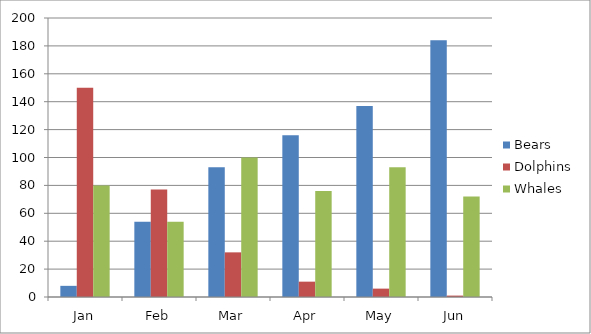
| Category | Bears | Dolphins | Whales |
|---|---|---|---|
| Jan | 8 | 150 | 80 |
| Feb | 54 | 77 | 54 |
| Mar | 93 | 32 | 100 |
| Apr | 116 | 11 | 76 |
| May | 137 | 6 | 93 |
| Jun | 184 | 1 | 72 |